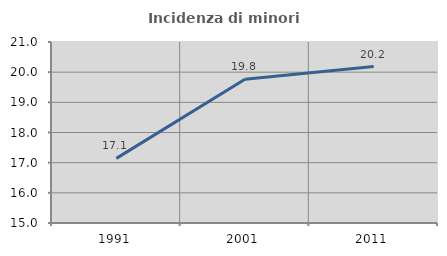
| Category | Incidenza di minori stranieri |
|---|---|
| 1991.0 | 17.143 |
| 2001.0 | 19.765 |
| 2011.0 | 20.186 |